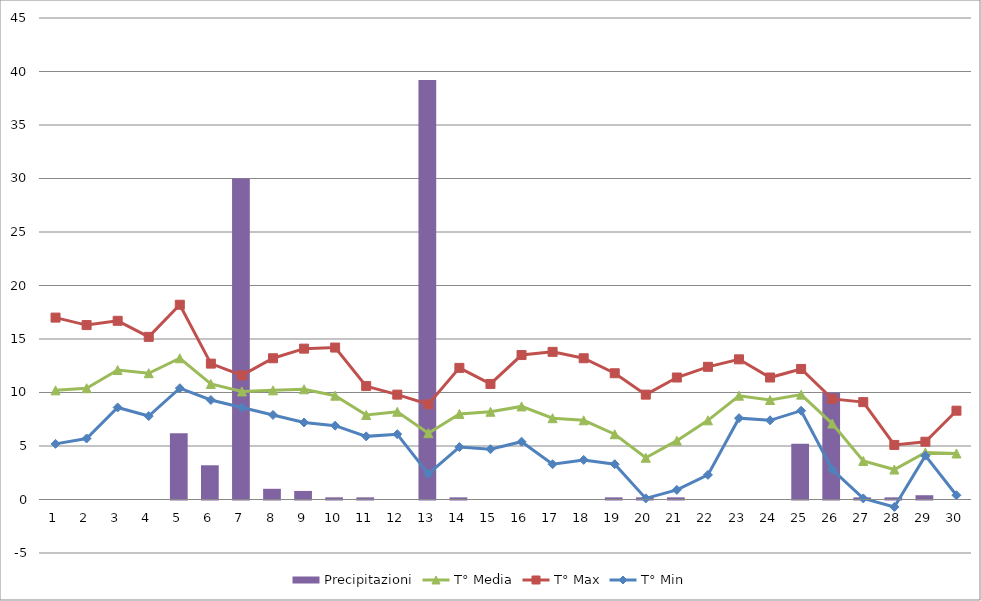
| Category | Precipitazioni |
|---|---|
| 0 | 0 |
| 1 | 0 |
| 2 | 0 |
| 3 | 0 |
| 4 | 6.2 |
| 5 | 3.2 |
| 6 | 30 |
| 7 | 1 |
| 8 | 0.8 |
| 9 | 0.2 |
| 10 | 0.2 |
| 11 | 0 |
| 12 | 39.2 |
| 13 | 0.2 |
| 14 | 0 |
| 15 | 0 |
| 16 | 0 |
| 17 | 0 |
| 18 | 0.2 |
| 19 | 0.2 |
| 20 | 0.2 |
| 21 | 0 |
| 22 | 0 |
| 23 | 0 |
| 24 | 5.2 |
| 25 | 10 |
| 26 | 0.2 |
| 27 | 0.2 |
| 28 | 0.4 |
| 29 | 0 |